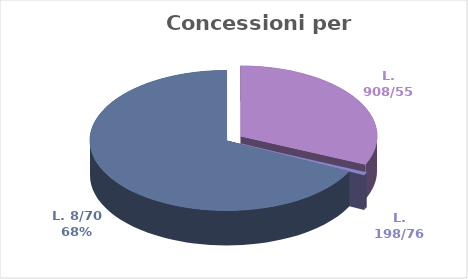
| Category | Series 0 |
|---|---|
| L. 908/55 | 32629500 |
| L. 198/76 | 637500 |
| L. 8/70 | 69867765 |